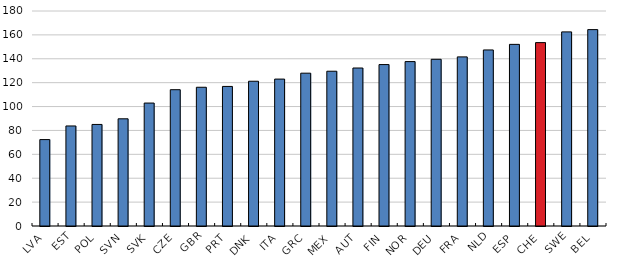
| Category | Series 0 |
|---|---|
| LVA | 72.349 |
| EST | 83.749 |
| POL | 85.026 |
| SVN | 89.742 |
| SVK | 102.934 |
| CZE | 114.121 |
| GBR | 116.156 |
| PRT | 116.849 |
| DNK | 121.188 |
| ITA | 122.995 |
| GRC | 127.941 |
| MEX | 129.573 |
| AUT | 132.277 |
| FIN | 135.145 |
| NOR | 137.637 |
| DEU | 139.568 |
| FRA | 141.588 |
| NLD | 147.393 |
| ESP | 152.067 |
| CHE | 153.529 |
| SWE | 162.518 |
| BEL | 164.413 |